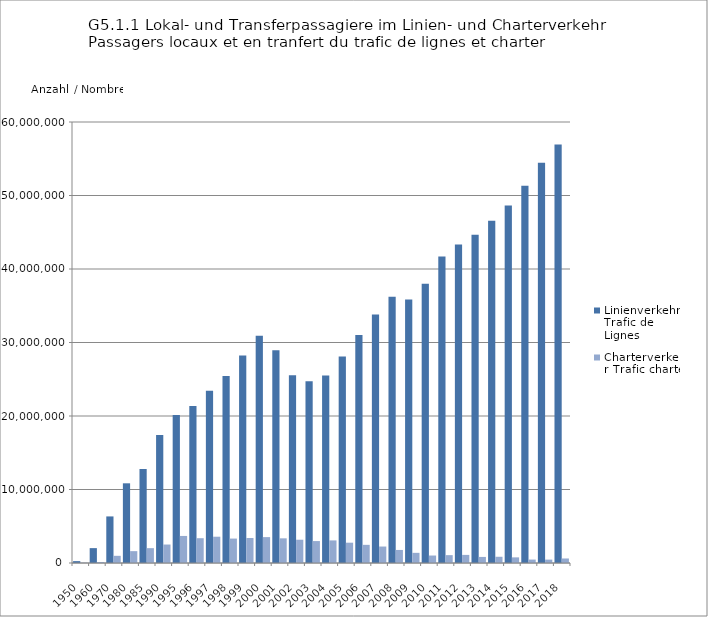
| Category | Linienverkehr Trafic de Lignes | Charterverkehr Trafic charter |
|---|---|---|
| 1950.0 | 253841 | 41022 |
| 1960.0 | 2023236 | 137323 |
| 1970.0 | 6337115 | 976936 |
| 1980.0 | 10841892 | 1613283 |
| 1985.0 | 12793091 | 2020245 |
| 1990.0 | 17429429 | 2512970 |
| 1995.0 | 20125817 | 3681340 |
| 1996.0 | 21357627 | 3373923 |
| 1997.0 | 23441048 | 3576564 |
| 1998.0 | 25458347 | 3322957 |
| 1999.0 | 28247600 | 3398247 |
| 2000.0 | 30903947 | 3522854 |
| 2001.0 | 28935233 | 3356535 |
| 2002.0 | 25550674 | 3166327 |
| 2003.0 | 24738668 | 2984620 |
| 2004.0 | 25496561 | 3074237 |
| 2005.0 | 28096814 | 2763237 |
| 2006.0 | 31017882 | 2470001 |
| 2007.0 | 33826265 | 2240899 |
| 2008.0 | 36221048 | 1774796 |
| 2009.0 | 35853037 | 1381990 |
| 2010.0 | 37991700 | 1017346 |
| 2011.0 | 41704038 | 1069301 |
| 2012.0 | 43341576 | 1102634 |
| 2013.0 | 44675890 | 825643 |
| 2014.0 | 46558454 | 847977 |
| 2015.0 | 48626319 | 766381 |
| 2016.0 | 51334271 | 466259 |
| 2017.0 | 54451314 | 460591 |
| 2018.0 | 56940045 | 614750 |